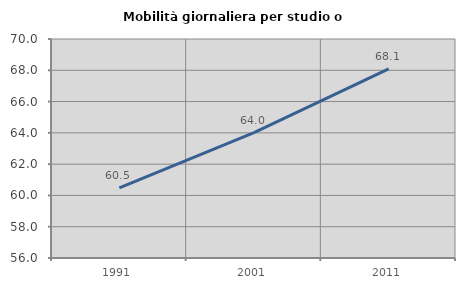
| Category | Mobilità giornaliera per studio o lavoro |
|---|---|
| 1991.0 | 60.489 |
| 2001.0 | 64.01 |
| 2011.0 | 68.097 |